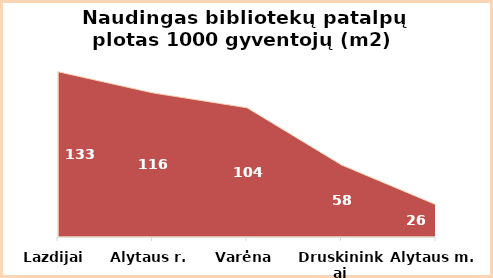
| Category | Series 0 |
|---|---|
| Lazdijai | 133 |
| Alytaus r. | 116 |
| Varėna | 104 |
| Druskininkai | 58 |
| Alytaus m. | 26 |